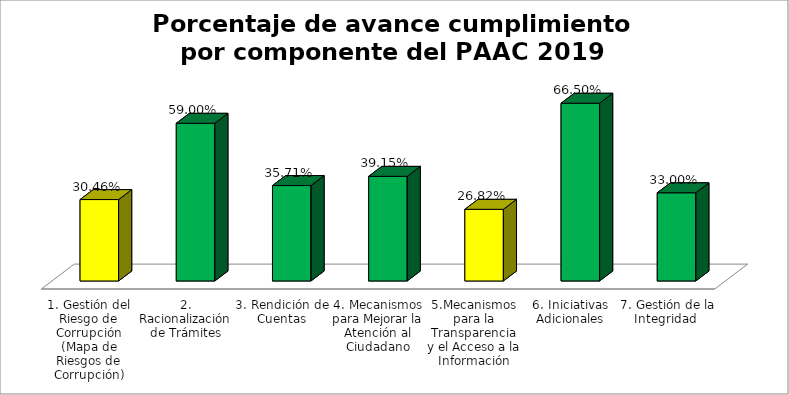
| Category | Series 0 |
|---|---|
| 1. Gestión del Riesgo de Corrupción (Mapa de Riesgos de Corrupción) | 0.305 |
| 2. Racionalización de Trámites | 0.59 |
| 3. Rendición de Cuentas | 0.357 |
| 4. Mecanismos para Mejorar la Atención al Ciudadano | 0.391 |
| 5.Mecanismos para la Transparencia y el Acceso a la Información | 0.268 |
| 6. Iniciativas Adicionales | 0.665 |
| 7. Gestión de la Integridad  | 0.33 |